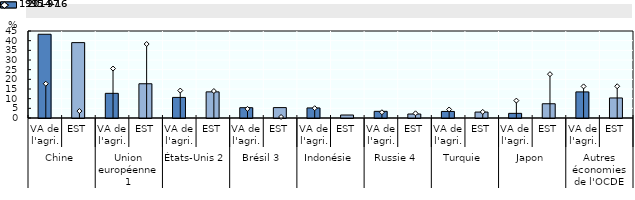
| Category | 2014-16 |
|---|---|
| 0 | 43.318 |
| 1 | 38.992 |
| 2 | 12.756 |
| 3 | 17.715 |
| 4 | 10.648 |
| 5 | 13.518 |
| 6 | 5.33 |
| 7 | 5.38 |
| 8 | 5.206 |
| 9 | 1.544 |
| 10 | 3.449 |
| 11 | 2.054 |
| 12 | 3.388 |
| 13 | 3.064 |
| 14 | 2.403 |
| 15 | 7.368 |
| 16 | 13.503 |
| 17 | 10.366 |